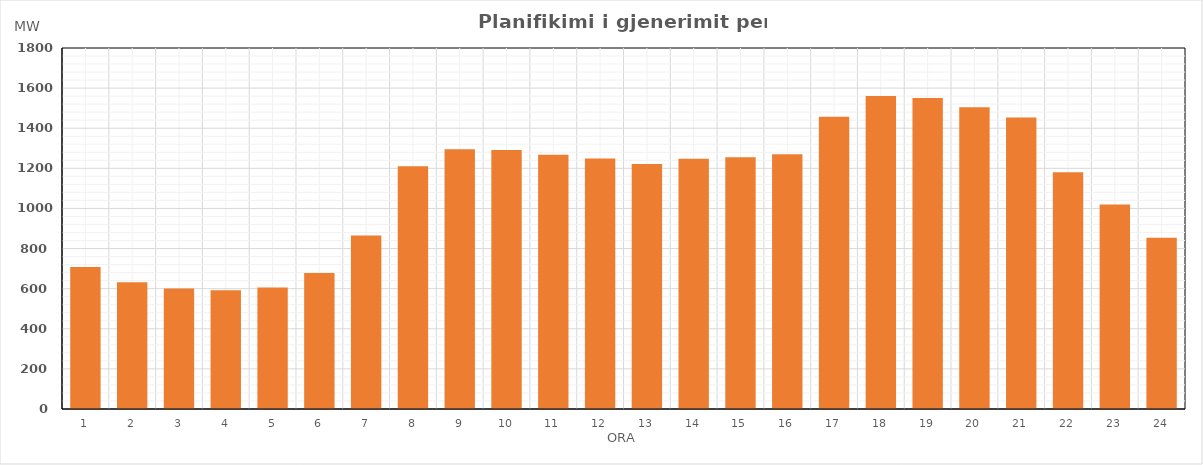
| Category | Max (MW) |
|---|---|
| 0 | 707.75 |
| 1 | 631.765 |
| 2 | 600.735 |
| 3 | 591.765 |
| 4 | 605.711 |
| 5 | 677.711 |
| 6 | 864.581 |
| 7 | 1210.764 |
| 8 | 1294.933 |
| 9 | 1290.948 |
| 10 | 1267.859 |
| 11 | 1248.819 |
| 12 | 1221.895 |
| 13 | 1248.008 |
| 14 | 1254.903 |
| 15 | 1269.838 |
| 16 | 1457.74 |
| 17 | 1560.923 |
| 18 | 1551.021 |
| 19 | 1504.927 |
| 20 | 1452.883 |
| 21 | 1180.958 |
| 22 | 1019.849 |
| 23 | 853.741 |